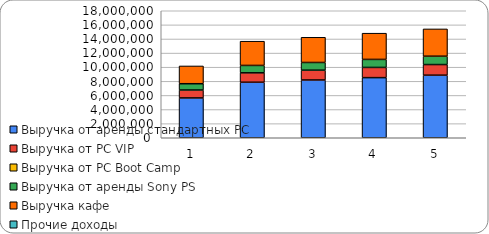
| Category | Выручка от аренды стандартных PC | Выручка от PC VIP | Выручка от PC Boot Camp | Выручка от аренды Sony PS  | Выручка кафе | Прочие доходы |
|---|---|---|---|---|---|---|
| 0 | 5643000 | 1124352 | 0 | 890208 | 2520288 | 0 |
| 1 | 7867090.899 | 1335021.486 | 0 | 1048945.453 | 3432912.392 | 0 |
| 2 | 8187608.32 | 1389412.321 | 0 | 1091681.109 | 3572774.54 | 0 |
| 3 | 8521184.116 | 1446019.123 | 0 | 1136157.882 | 3718334.887 | 0 |
| 4 | 8868350.304 | 1504932.173 | 0 | 1182446.707 | 3869825.587 | 0 |